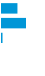
| Category | Series 0 |
|---|---|
| 0 | 0.386 |
| 1 | 0.6 |
| 2 | 0.013 |
| 3 | 0 |